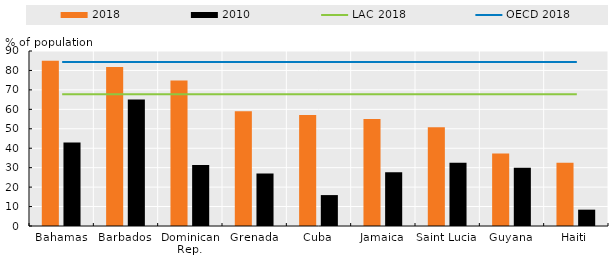
| Category | 2018 | 2010 |
|---|---|---|
| Bahamas | 85 | 43 |
| Barbados | 81.761 | 65.1 |
| Dominican Rep. | 74.8 | 31.4 |
| Grenada | 59.072 | 27 |
| Cuba | 57.148 | 15.9 |
| Jamaica | 55.072 | 27.67 |
| Saint Lucia | 50.815 | 32.5 |
| Guyana | 37.326 | 29.9 |
| Haiti | 32.474 | 8.4 |